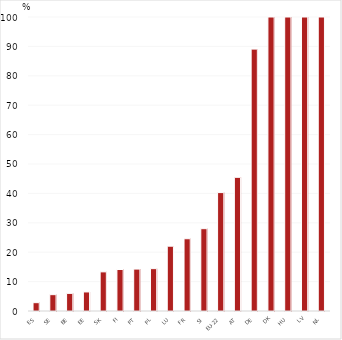
| Category | Proportion of students enrolled in work-based learning programmes |
|---|---|
| ES | 2.831 |
| SE | 5.555 |
| BE | 5.99 |
| EE | 6.48 |
| SK | 13.309 |
| FI | 14.114 |
| PT | 14.262 |
| PL | 14.404 |
| LU | 22.044 |
| FR | 24.578 |
| SI | 28 |
| EU-22 | 40.278 |
| AT | 45.465 |
| DE | 89.073 |
| DK | 100 |
| HU | 100 |
| LV | 100 |
| NL | 100 |